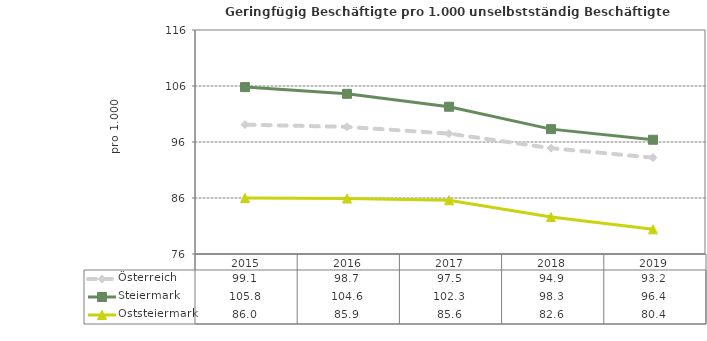
| Category | Österreich | Steiermark | Oststeiermark |
|---|---|---|---|
| 2019.0 | 93.2 | 96.4 | 80.4 |
| 2018.0 | 94.9 | 98.3 | 82.6 |
| 2017.0 | 97.5 | 102.3 | 85.6 |
| 2016.0 | 98.7 | 104.6 | 85.9 |
| 2015.0 | 99.1 | 105.8 | 86 |